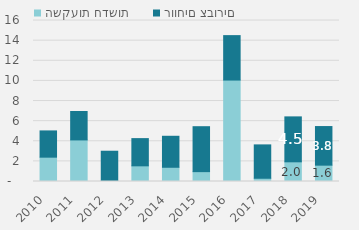
| Category | השקעות חדשות | רווחים צבורים |
|---|---|---|
| 2010 | 2418.192 | 2611 |
| 2011 | 4133.294 | 2827 |
| 2012 | 98.062 | 2911 |
| 2013 | 1557.532 | 2706 |
| 2014 | 1414.164 | 3082 |
| 2015 | 980.288 | 4468 |
| 2016 | 10083.695 | 4419 |
| 2017 | 322.448 | 3317 |
| 2018 | 1956.978 | 4467 |
| 2019 | 1624 | 3839 |